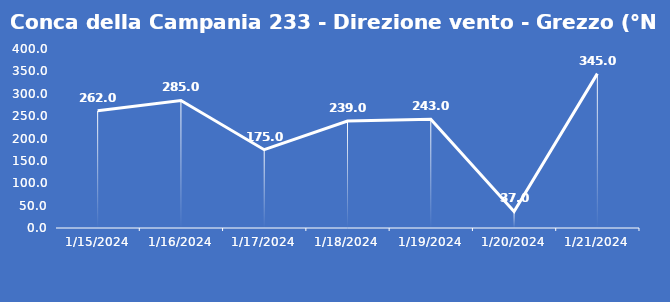
| Category | Conca della Campania 233 - Direzione vento - Grezzo (°N) |
|---|---|
| 1/15/24 | 262 |
| 1/16/24 | 285 |
| 1/17/24 | 175 |
| 1/18/24 | 239 |
| 1/19/24 | 243 |
| 1/20/24 | 37 |
| 1/21/24 | 345 |